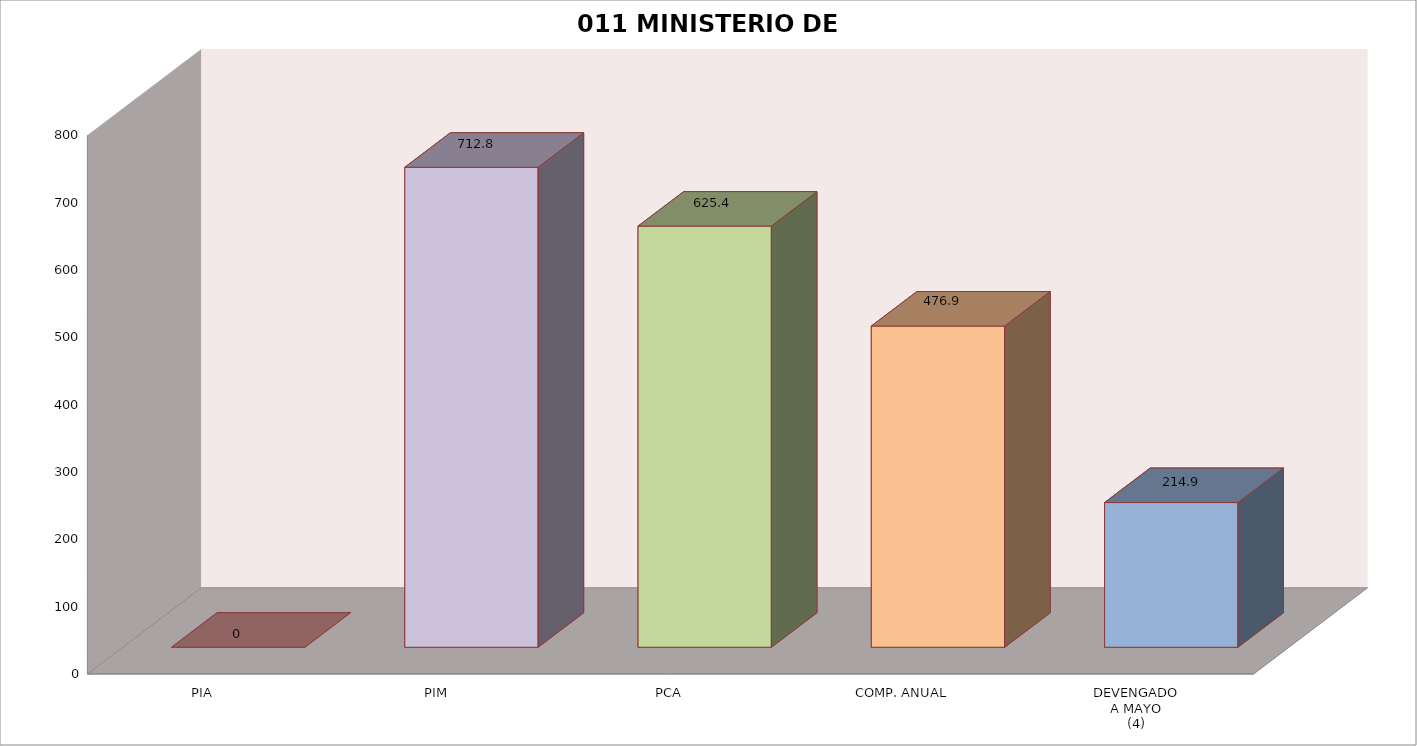
| Category | 011 MINISTERIO DE SALUD |
|---|---|
| PIA | 0 |
| PIM | 712.753 |
| PCA | 625.351 |
| COMP. ANUAL | 476.945 |
| DEVENGADO
A MAYO
(4) | 214.859 |